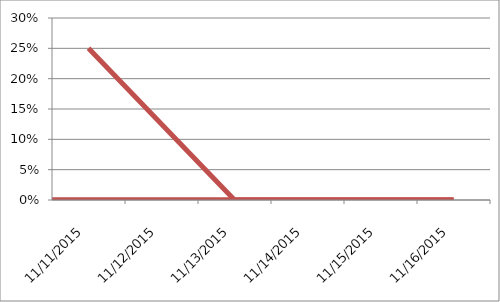
| Category | Series 1 |
|---|---|
| 11/11/15 | 0.25 |
| 11/13/15 | 0 |
| 11/14/15 | 0 |
| 11/16/15 | 0 |
| nan | 0 |
| nan | 0 |
| nan | 0 |
| nan | 0 |
| nan | 0 |
| nan | 0 |
| nan | 0 |
| nan | 0 |
| nan | 0 |
| nan | 0 |
| nan | 0 |
| nan | 0 |
| nan | 0 |
| nan | 0 |
| nan | 0 |
| nan | 0 |
| nan | 0 |
| nan | 0 |
| nan | 0 |
| nan | 0 |
| nan | 0 |
| nan | 0 |
| nan | 0 |
| nan | 0 |
| nan | 0 |